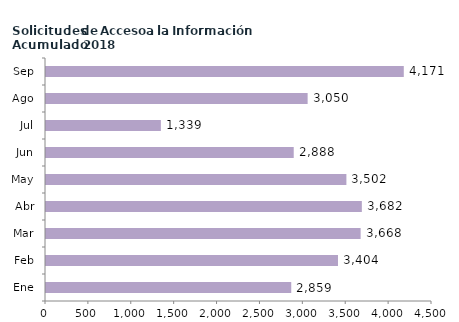
| Category | Series 0 |
|---|---|
| Ene | 2859 |
| Feb | 3404 |
| Mar | 3668 |
| Abr | 3682 |
| May | 3502 |
| Jun | 2888 |
| Jul | 1339 |
| Ago | 3050 |
| Sep | 4171 |